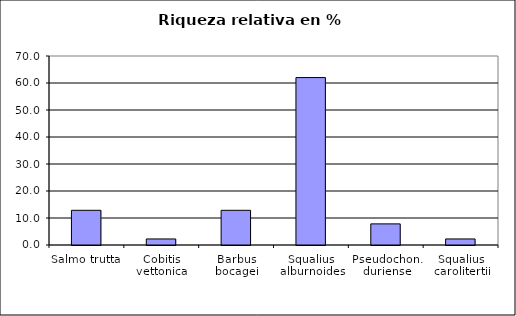
| Category | Series 0 |
|---|---|
| Salmo trutta | 12.849 |
| Cobitis vettonica | 2.235 |
| Barbus bocagei | 12.849 |
| Squalius alburnoides | 62.011 |
| Pseudochon. duriense | 7.821 |
| Squalius carolitertii | 2.235 |